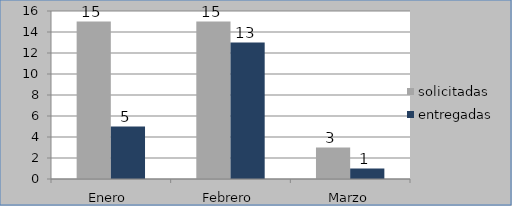
| Category | solicitadas | entregadas |
|---|---|---|
| Enero  | 15 | 5 |
| Febrero | 15 | 13 |
| Marzo | 3 | 1 |